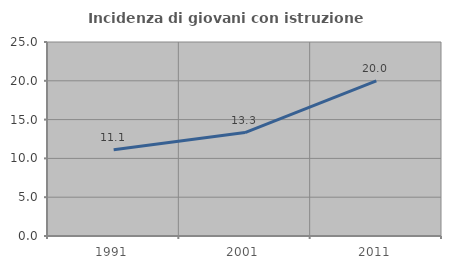
| Category | Incidenza di giovani con istruzione universitaria |
|---|---|
| 1991.0 | 11.111 |
| 2001.0 | 13.333 |
| 2011.0 | 20 |